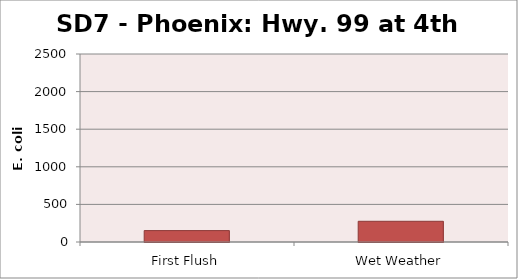
| Category | E. coli MPN - |
|---|---|
| First Flush | 151.5 |
| Wet Weather | 275.5 |